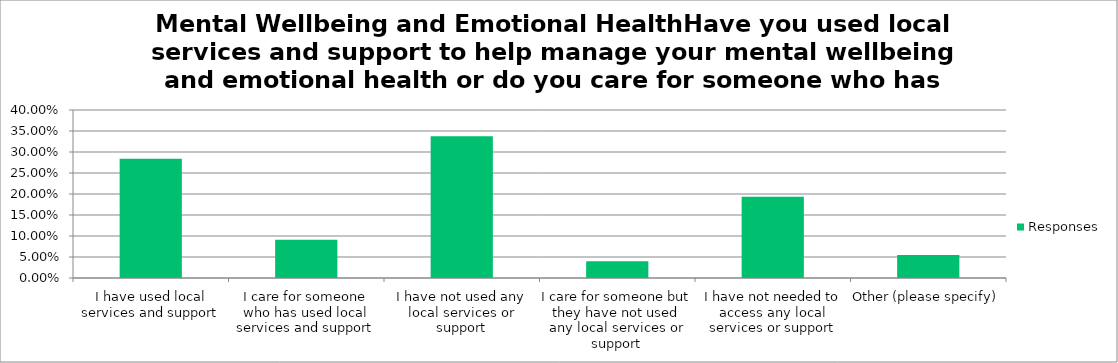
| Category | Responses |
|---|---|
| I have used local services and support | 0.284 |
| I care for someone who has used local services and support | 0.091 |
| I have not used any local services or support | 0.338 |
| I care for someone but they have not used any local services or support | 0.04 |
| I have not needed to access any local services or support | 0.193 |
| Other (please specify) | 0.055 |